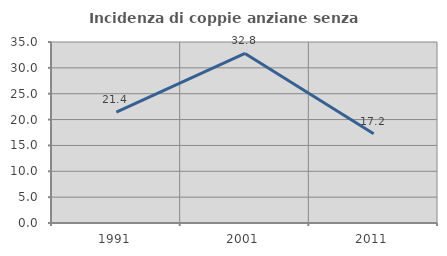
| Category | Incidenza di coppie anziane senza figli  |
|---|---|
| 1991.0 | 21.429 |
| 2001.0 | 32.787 |
| 2011.0 | 17.241 |